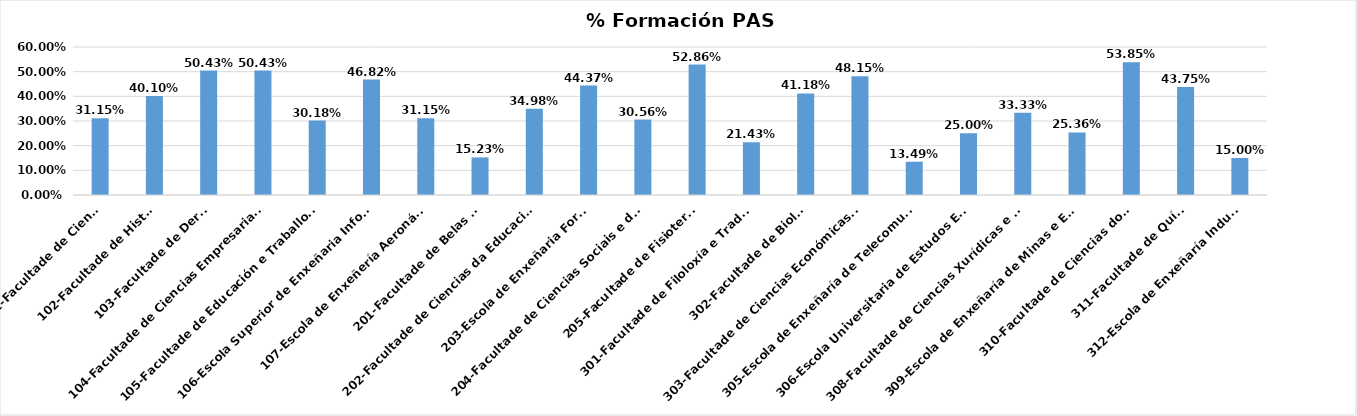
| Category | Series 0 |
|---|---|
| 101-Facultade de Ciencias | 0.312 |
| 102-Facultade de Historia | 0.401 |
| 103-Facultade de Dereito | 0.504 |
| 104-Facultade de Ciencias Empresariais e Turismo | 0.504 |
| 105-Facultade de Educación e Traballo Social | 0.302 |
| 106-Escola Superior de Enxeñaria Informática | 0.468 |
| 107-Escola de Enxeñería Aeronáutica | 0.312 |
| 201-Facultade de Belas Artes | 0.152 |
| 202-Facultade de Ciencias da Educación e do Deporte | 0.35 |
| 203-Escola de Enxeñaria Forestal | 0.444 |
| 204-Facultade de Ciencias Sociais e da Comunicación | 0.306 |
| 205-Facultade de Fisioterapia | 0.529 |
| 301-Facultade de Filoloxía e Traducción | 0.214 |
| 302-Facultade de Bioloxía | 0.412 |
| 303-Facultade de Ciencias Económicas e Empresariais | 0.481 |
| 305-Escola de Enxeñaría de Telecomunicacións | 0.135 |
| 306-Escola Universitaria de Estudos Empresariais | 0.25 |
| 308-Facultade de Ciencias Xurídicas e do Traballo | 0.333 |
| 309-Escola de Enxeñaría de Minas e Enerxía | 0.254 |
| 310-Facultade de Ciencias do Mar | 0.538 |
| 311-Facultade de Química | 0.438 |
| 312-Escola de Enxeñaría Industrial | 0.15 |